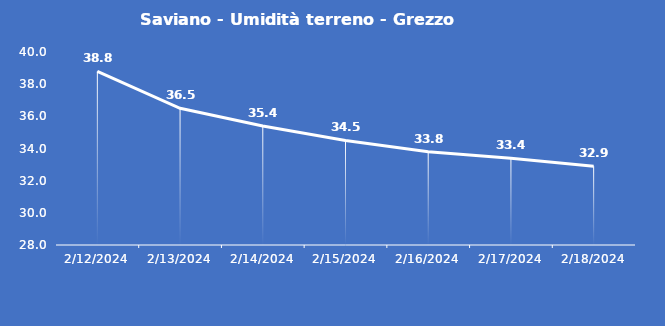
| Category | Saviano - Umidità terreno - Grezzo (%VWC) |
|---|---|
| 2/12/24 | 38.8 |
| 2/13/24 | 36.5 |
| 2/14/24 | 35.4 |
| 2/15/24 | 34.5 |
| 2/16/24 | 33.8 |
| 2/17/24 | 33.4 |
| 2/18/24 | 32.9 |